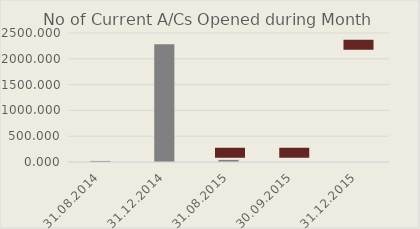
| Category | No of Current A/Cs Opened during Month |
|---|---|
| 31.08.2014 | 20 |
| 31.12.2014 | 2280 |
| 31.08.2015 | 41 |
| 30.09.2015 | 0 |
| 31.12.2015 | 0 |